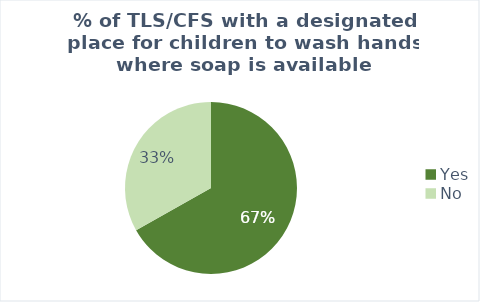
| Category | Average of % of TLS/CFS with a designated place for children to wash hands where soap is available |
|---|---|
| Yes | 0.668 |
| No | 0.332 |